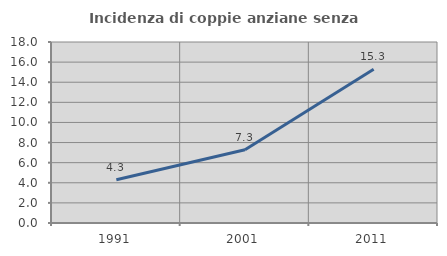
| Category | Incidenza di coppie anziane senza figli  |
|---|---|
| 1991.0 | 4.306 |
| 2001.0 | 7.278 |
| 2011.0 | 15.297 |